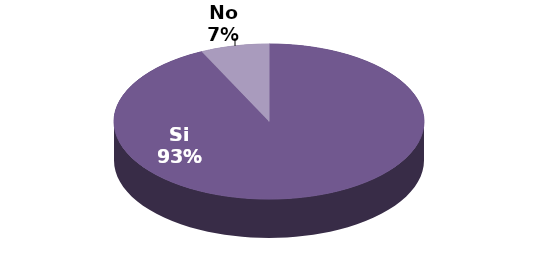
| Category | Series 1 |
|---|---|
| Si | 26 |
| No | 2 |